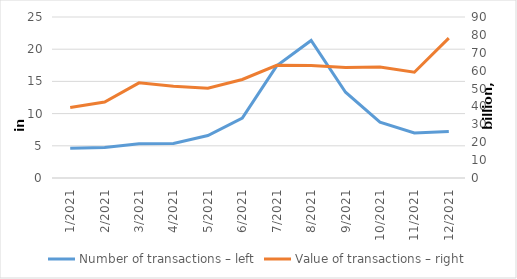
| Category | Number of transactions – left |
|---|---|
| 1/2021 | 4617131 |
| 2/2021 | 4751386 |
| 3/2021 | 5323427 |
| 4/2021 | 5374273 |
| 5/2021 | 6587230 |
| 6/2021 | 9294530 |
| 7/2021 | 17415444 |
| 8/2021 | 21363200 |
| 9/2021 | 13317432 |
| 10/2021 | 8673600 |
| 11/2021 | 7000033 |
| 12/2021 | 7232264 |